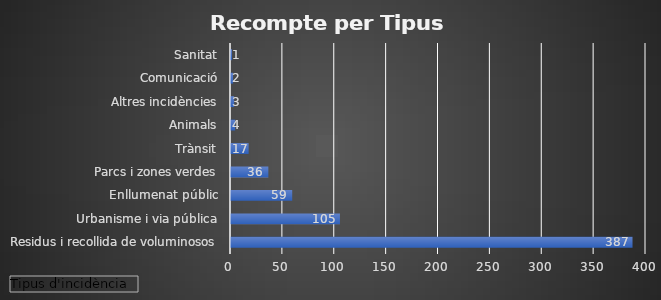
| Category | Total |
|---|---|
| Residus i recollida de voluminosos | 387 |
| Urbanisme i via pública | 105 |
| Enllumenat públic | 59 |
| Parcs i zones verdes | 36 |
| Trànsit | 17 |
| Animals | 4 |
| Altres incidències | 3 |
| Comunicació | 2 |
| Sanitat | 1 |